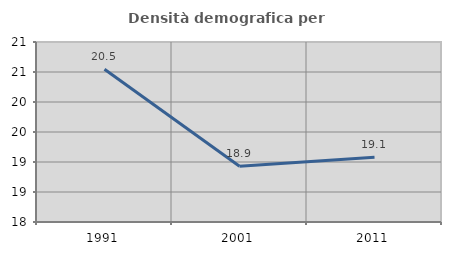
| Category | Densità demografica |
|---|---|
| 1991.0 | 20.546 |
| 2001.0 | 18.929 |
| 2011.0 | 19.08 |